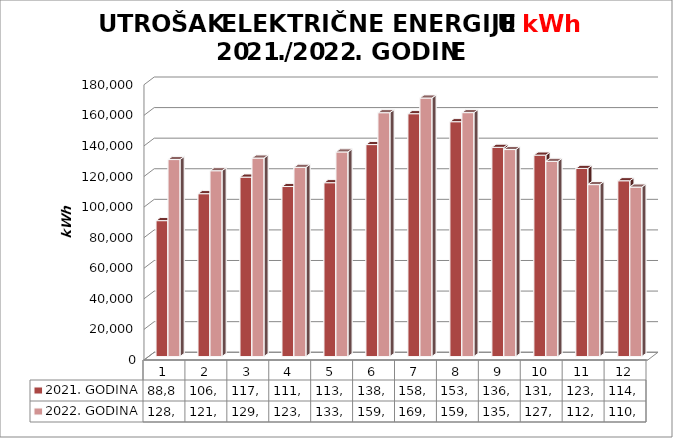
| Category | 2021. GODINA | 2022. GODINA |
|---|---|---|
| 0 | 88892 | 128837 |
| 1 | 106520 | 121531 |
| 2 | 117357 | 129803 |
| 3 | 111199 | 123744 |
| 4 | 113700 | 133816 |
| 5 | 138631 | 159482 |
| 6 | 158827 | 169073 |
| 7 | 153588 | 159524 |
| 8 | 136846 | 135385 |
| 9 | 131726 | 127630 |
| 10 | 123040 | 112456 |
| 11 | 114977 | 110827 |